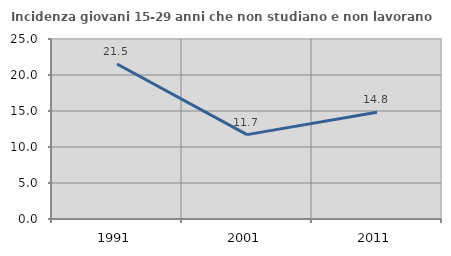
| Category | Incidenza giovani 15-29 anni che non studiano e non lavorano  |
|---|---|
| 1991.0 | 21.531 |
| 2001.0 | 11.719 |
| 2011.0 | 14.815 |